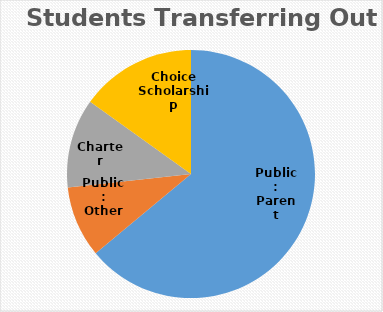
| Category | Series 0 |
|---|---|
| Public: Parent Choice | 55 |
| Public: Other | 8 |
| Charter | 10 |
| Choice Scholarship | 13 |